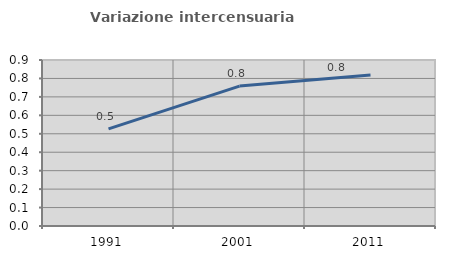
| Category | Variazione intercensuaria annua |
|---|---|
| 1991.0 | 0.527 |
| 2001.0 | 0.758 |
| 2011.0 | 0.819 |